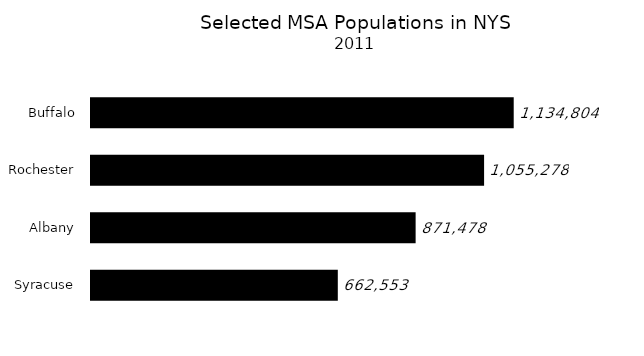
| Category | Series 0 |
|---|---|
| Syracuse | 662553 |
| Albany | 871478 |
| Rochester | 1055278 |
| Buffalo | 1134804 |